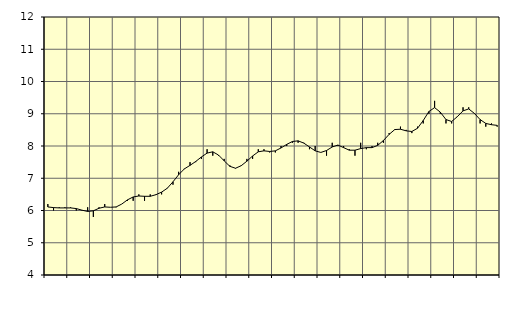
| Category | Piggar | Byggverksamhet, SNI 41-43 |
|---|---|---|
| nan | 6.2 | 6.11 |
| 1.0 | 6 | 6.09 |
| 1.0 | 6.1 | 6.08 |
| 1.0 | 6.1 | 6.08 |
| nan | 6.1 | 6.08 |
| 2.0 | 6 | 6.06 |
| 2.0 | 6 | 6.01 |
| 2.0 | 6.1 | 5.97 |
| nan | 5.8 | 5.99 |
| 3.0 | 6.1 | 6.07 |
| 3.0 | 6.2 | 6.11 |
| 3.0 | 6.1 | 6.1 |
| nan | 6.1 | 6.11 |
| 4.0 | 6.2 | 6.2 |
| 4.0 | 6.3 | 6.33 |
| 4.0 | 6.3 | 6.42 |
| nan | 6.5 | 6.45 |
| 5.0 | 6.3 | 6.44 |
| 5.0 | 6.5 | 6.44 |
| 5.0 | 6.5 | 6.49 |
| nan | 6.5 | 6.57 |
| 6.0 | 6.7 | 6.69 |
| 6.0 | 6.8 | 6.89 |
| 6.0 | 7.2 | 7.11 |
| nan | 7.3 | 7.29 |
| 7.0 | 7.5 | 7.4 |
| 7.0 | 7.5 | 7.52 |
| 7.0 | 7.6 | 7.66 |
| nan | 7.9 | 7.78 |
| 8.0 | 7.7 | 7.82 |
| 8.0 | 7.7 | 7.72 |
| 8.0 | 7.6 | 7.54 |
| nan | 7.4 | 7.37 |
| 9.0 | 7.3 | 7.31 |
| 9.0 | 7.4 | 7.39 |
| 9.0 | 7.6 | 7.53 |
| nan | 7.6 | 7.69 |
| 10.0 | 7.9 | 7.82 |
| 10.0 | 7.9 | 7.85 |
| 10.0 | 7.8 | 7.83 |
| nan | 7.8 | 7.85 |
| 11.0 | 8 | 7.94 |
| 11.0 | 8 | 8.05 |
| 11.0 | 8.1 | 8.14 |
| nan | 8.1 | 8.16 |
| 12.0 | 8.1 | 8.09 |
| 12.0 | 7.9 | 7.97 |
| 12.0 | 8 | 7.85 |
| nan | 7.8 | 7.8 |
| 13.0 | 7.7 | 7.86 |
| 13.0 | 8.1 | 7.97 |
| 13.0 | 8 | 8.03 |
| nan | 8 | 7.95 |
| 14.0 | 7.9 | 7.87 |
| 14.0 | 7.7 | 7.87 |
| 14.0 | 8.1 | 7.92 |
| nan | 7.9 | 7.95 |
| 15.0 | 8 | 7.95 |
| 15.0 | 8.1 | 8.02 |
| 15.0 | 8.1 | 8.17 |
| nan | 8.4 | 8.36 |
| 16.0 | 8.5 | 8.51 |
| 16.0 | 8.6 | 8.52 |
| 16.0 | 8.5 | 8.47 |
| nan | 8.4 | 8.45 |
| 17.0 | 8.6 | 8.55 |
| 17.0 | 8.7 | 8.79 |
| 17.0 | 9 | 9.07 |
| nan | 9.4 | 9.19 |
| 18.0 | 9 | 9.05 |
| 18.0 | 8.7 | 8.82 |
| 18.0 | 8.7 | 8.76 |
| nan | 8.9 | 8.91 |
| 19.0 | 9.2 | 9.09 |
| 19.0 | 9.2 | 9.15 |
| 19.0 | 9 | 9.01 |
| nan | 8.7 | 8.82 |
| 20.0 | 8.6 | 8.7 |
| 20.0 | 8.7 | 8.66 |
| 20.0 | 8.6 | 8.64 |